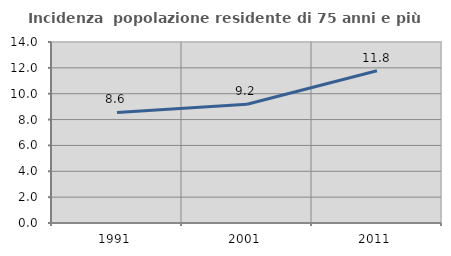
| Category | Incidenza  popolazione residente di 75 anni e più |
|---|---|
| 1991.0 | 8.555 |
| 2001.0 | 9.191 |
| 2011.0 | 11.777 |